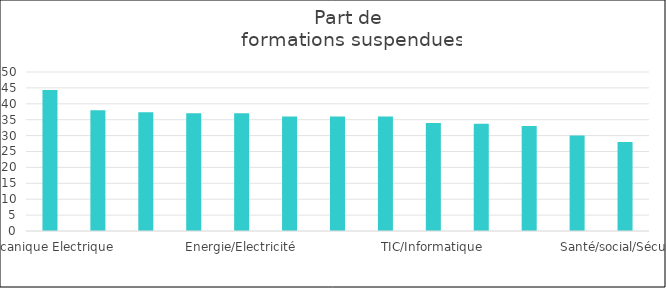
| Category | Part de 
formations suspendues |
|---|---|
| Mécanique Electrique | 44.375 |
| Bâtiment-Construction | 38 |
| Devt Personnel | 37.354 |
| Commerce/Marketing/Finance | 37 |
| Energie/Electricité | 37 |
| Industrie, transport-Logistique | 36 |
| Transformation matière | 36 |
| Sciences sociales/Langues | 36 |
| TIC/Informatique | 34 |
| Sport/loisir/Tourisme | 33.724 |
| Agriculture-environnement | 33 |
| Gestion/ressources humaines | 30 |
| Santé/social/Sécurité | 28 |